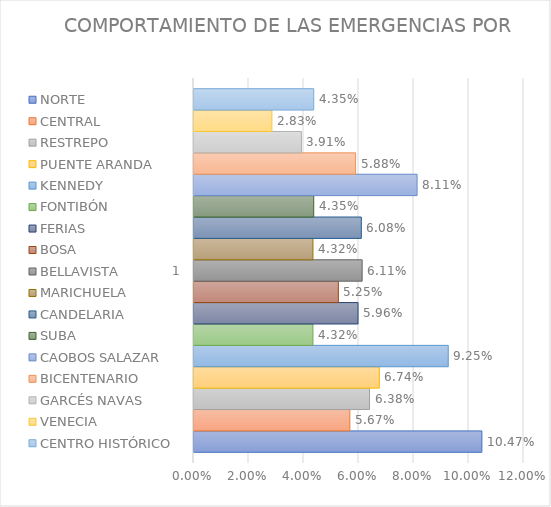
| Category | NORTE | CENTRAL | RESTREPO | PUENTE ARANDA | KENNEDY | FONTIBÓN | FERIAS | BOSA | BELLAVISTA | MARICHUELA | CANDELARIA | SUBA | CAOBOS SALAZAR | BICENTENARIO | GARCÉS NAVAS | VENECIA | CENTRO HISTÓRICO |
|---|---|---|---|---|---|---|---|---|---|---|---|---|---|---|---|---|---|
| 0 | 0.105 | 0.057 | 0.064 | 0.067 | 0.092 | 0.043 | 0.06 | 0.052 | 0.061 | 0.043 | 0.061 | 0.044 | 0.081 | 0.059 | 0.039 | 0.028 | 0.044 |